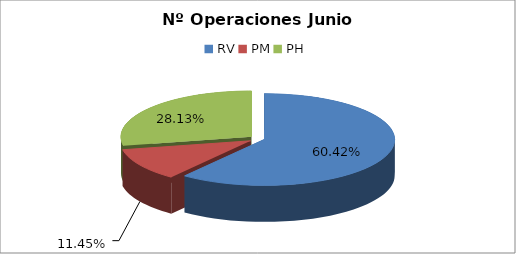
| Category | Series 0 |
|---|---|
| RV | 17272 |
| PM | 3273 |
| PH | 8041 |